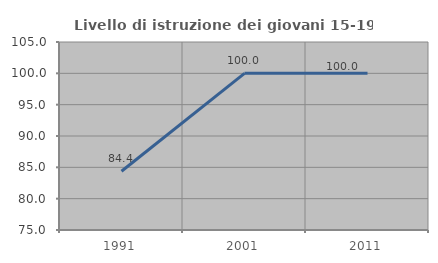
| Category | Livello di istruzione dei giovani 15-19 anni |
|---|---|
| 1991.0 | 84.375 |
| 2001.0 | 100 |
| 2011.0 | 100 |